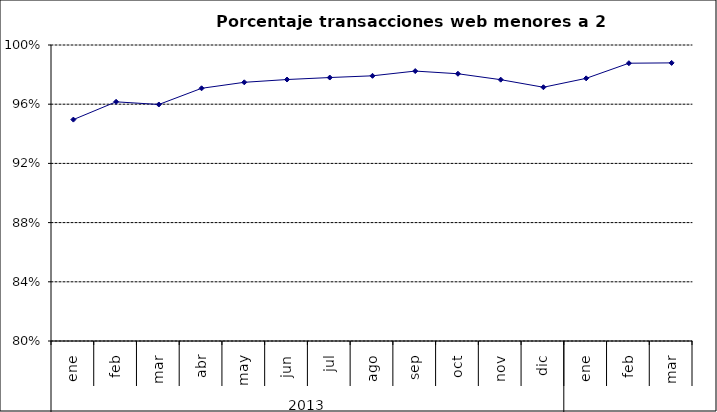
| Category | 94,96% 96,16% 95,98% 97,07% 97,48% 97,67% 97,80% 97,92% 98,24% 98,06% 97,66% 97,15% 97,75% 98,77% 98,79% |
|---|---|
| 0 | 0.95 |
| 1 | 0.962 |
| 2 | 0.96 |
| 3 | 0.971 |
| 4 | 0.975 |
| 5 | 0.977 |
| 6 | 0.978 |
| 7 | 0.979 |
| 8 | 0.982 |
| 9 | 0.981 |
| 10 | 0.977 |
| 11 | 0.971 |
| 12 | 0.977 |
| 13 | 0.988 |
| 14 | 0.988 |